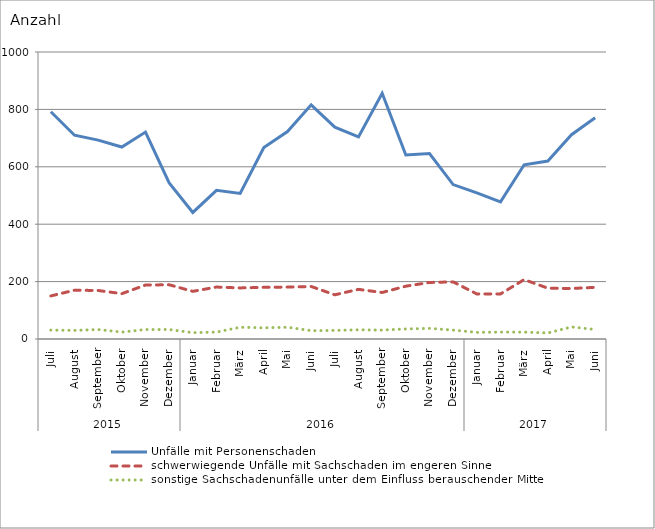
| Category | Unfälle mit Personenschaden | schwerwiegende Unfälle mit Sachschaden im engeren Sinne | sonstige Sachschadenunfälle unter dem Einfluss berauschender Mittel |
|---|---|---|---|
| 0 | 792 | 150 | 31 |
| 1 | 710 | 170 | 30 |
| 2 | 693 | 169 | 33 |
| 3 | 669 | 158 | 24 |
| 4 | 721 | 188 | 33 |
| 5 | 544 | 189 | 33 |
| 6 | 441 | 166 | 22 |
| 7 | 518 | 181 | 24 |
| 8 | 507 | 178 | 41 |
| 9 | 667 | 180 | 39 |
| 10 | 723 | 181 | 41 |
| 11 | 816 | 183 | 29 |
| 12 | 738 | 154 | 30 |
| 13 | 704 | 173 | 32 |
| 14 | 856 | 162 | 31 |
| 15 | 641 | 184 | 35 |
| 16 | 646 | 197 | 37 |
| 17 | 538 | 199 | 31 |
| 18 | 509 | 157 | 23 |
| 19 | 478 | 157 | 24 |
| 20 | 607 | 207 | 24 |
| 21 | 620 | 177 | 21 |
| 22 | 712 | 176 | 42 |
| 23 | 771 | 180 | 33 |